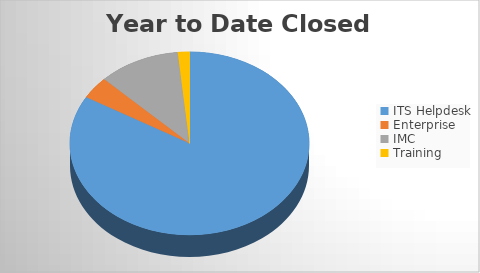
| Category | YTD Closed Tickets | 6M Opened |
|---|---|---|
| ITS Helpdesk | 1530 | 1544 |
| Enterprise | 72 | 69 |
| IMC | 203 | 200 |
| Training | 29 | 34 |